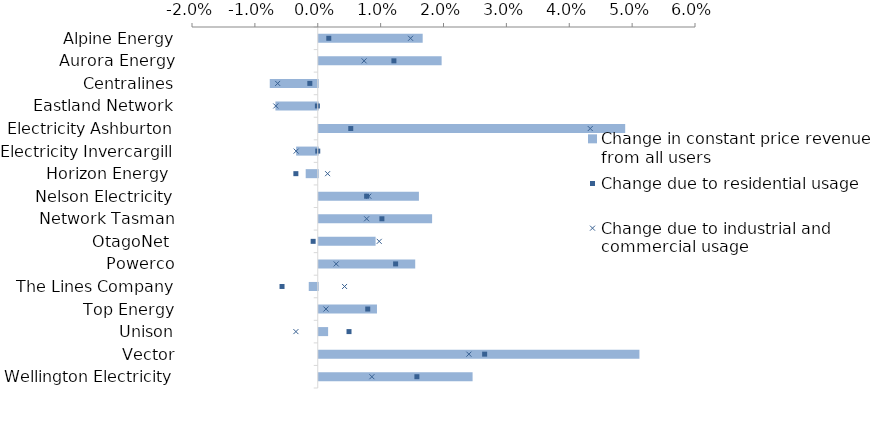
| Category | Change in constant price revenue from all users |
|---|---|
| Alpine Energy | 0.017 |
| Aurora Energy | 0.02 |
| Centralines | -0.008 |
| Eastland Network | -0.007 |
| Electricity Ashburton | 0.049 |
| Electricity Invercargill | -0.003 |
| Horizon Energy  | -0.002 |
| Nelson Electricity | 0.016 |
| Network Tasman | 0.018 |
| OtagoNet  | 0.009 |
| Powerco | 0.015 |
| The Lines Company | -0.001 |
| Top Energy | 0.009 |
| Unison | 0.001 |
| Vector | 0.051 |
| Wellington Electricity | 0.024 |